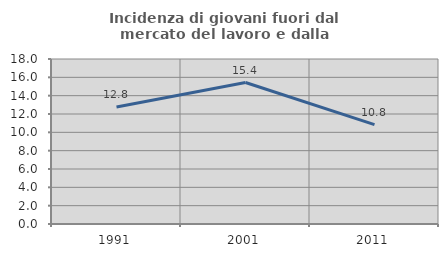
| Category | Incidenza di giovani fuori dal mercato del lavoro e dalla formazione  |
|---|---|
| 1991.0 | 12.773 |
| 2001.0 | 15.436 |
| 2011.0 | 10.843 |